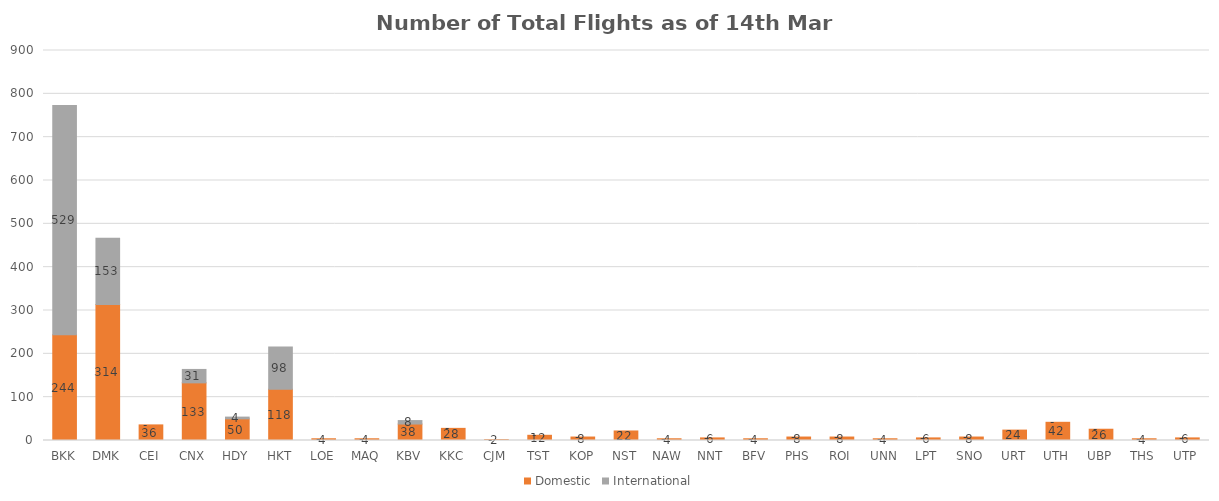
| Category | Domestic | International |
|---|---|---|
| BKK | 244 | 529 |
| DMK | 314 | 153 |
| CEI | 36 | 0 |
| CNX | 133 | 31 |
| HDY | 50 | 4 |
| HKT | 118 | 98 |
| LOE | 4 | 0 |
| MAQ | 4 | 0 |
| KBV | 38 | 8 |
| KKC | 28 | 0 |
| CJM | 2 | 0 |
| TST | 12 | 0 |
| KOP | 8 | 0 |
| NST | 22 | 0 |
| NAW | 4 | 0 |
| NNT | 6 | 0 |
| BFV | 4 | 0 |
| PHS | 8 | 0 |
| ROI | 8 | 0 |
| UNN | 4 | 0 |
| LPT | 6 | 0 |
| SNO | 8 | 0 |
| URT | 24 | 0 |
| UTH | 42 | 0 |
| UBP | 26 | 0 |
| THS | 4 | 0 |
| UTP | 6 | 0 |